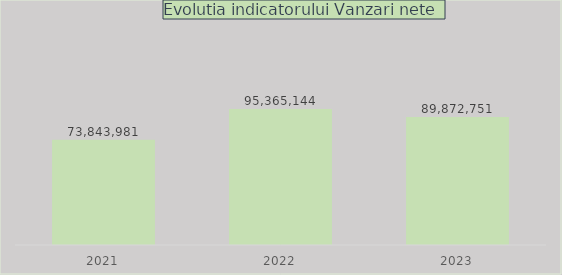
| Category | Series 0 |
|---|---|
| 2021.0 | 73843980.703 |
| 2022.0 | 95365144.089 |
| 2023.0 | 89872750.66 |